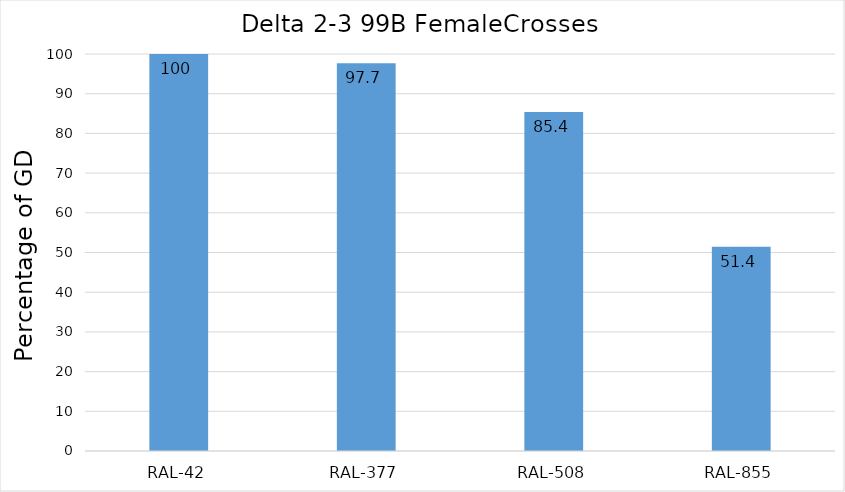
| Category | GD percentage |
|---|---|
| RAL-42 | 100 |
| RAL-377 | 97.674 |
| RAL-508 | 85.366 |
| RAL-855 | 51.449 |